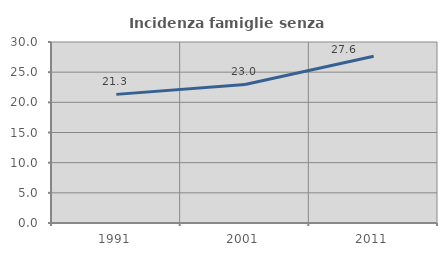
| Category | Incidenza famiglie senza nuclei |
|---|---|
| 1991.0 | 21.319 |
| 2001.0 | 22.96 |
| 2011.0 | 27.646 |